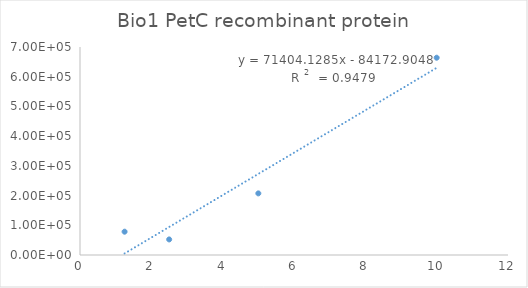
| Category | Series 0 |
|---|---|
| 10.0 | 663917.47 |
| 5.0 | 207376.98 |
| 2.5 | 52406.06 |
| 1.25 | 78435.28 |